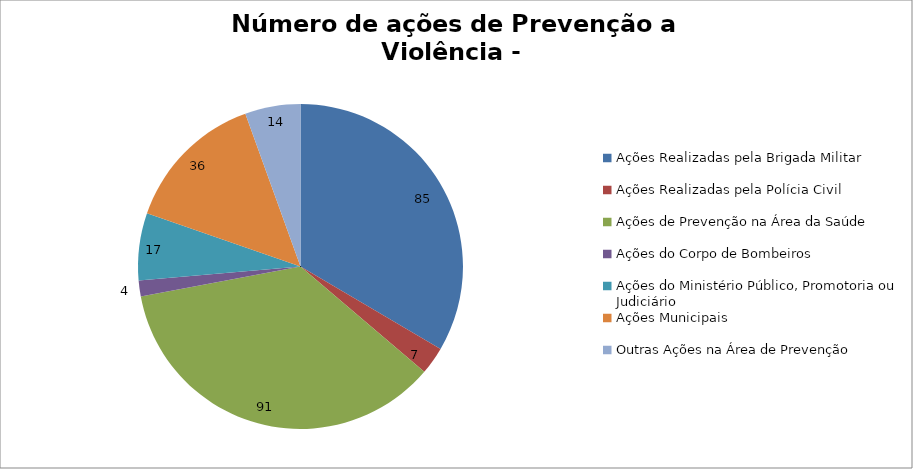
| Category | Número de Ações |
|---|---|
| Ações Realizadas pela Brigada Militar | 85 |
| Ações Realizadas pela Polícia Civil | 7 |
| Ações de Prevenção na Área da Saúde | 91 |
| Ações do Corpo de Bombeiros | 4 |
| Ações do Ministério Público, Promotoria ou Judiciário | 17 |
| Ações Municipais | 36 |
| Outras Ações na Área de Prevenção | 14 |